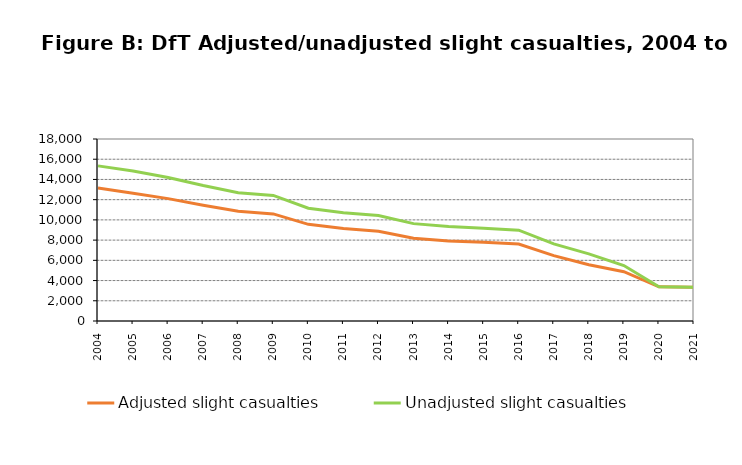
| Category | Adjusted slight casualties | Unadjusted slight casualties |
|---|---|---|
| 2004.0 | 13152 | 15342 |
| 2005.0 | 12625 | 14831 |
| 2006.0 | 12105 | 14198 |
| 2007.0 | 11444 | 13393 |
| 2008.0 | 10862 | 12690 |
| 2009.0 | 10593 | 12424 |
| 2010.0 | 9558 | 11152 |
| 2011.0 | 9153 | 10698 |
| 2012.0 | 8877 | 10442 |
| 2013.0 | 8184 | 9631 |
| 2014.0 | 7924 | 9336 |
| 2015.0 | 7779 | 9174 |
| 2016.0 | 7616 | 8980 |
| 2017.0 | 6469 | 7633 |
| 2018.0 | 5566 | 6635 |
| 2019.0 | 4878 | 5486 |
| 2020.0 | 3383 | 3383 |
| 2021.0 | 3348 | 3348 |